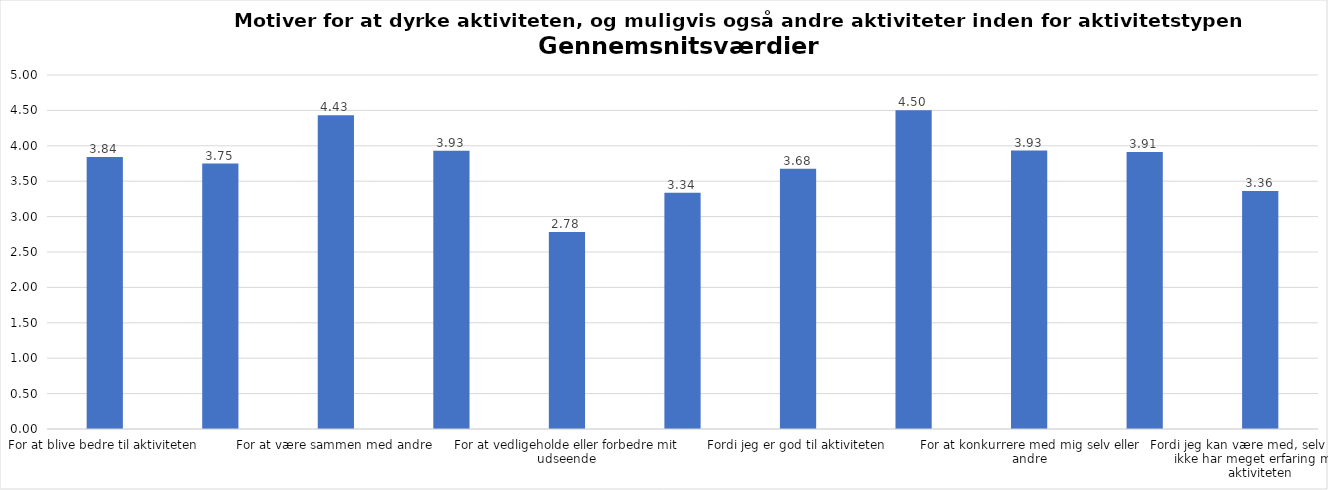
| Category | Gennemsnit |
|---|---|
| For at blive bedre til aktiviteten | 3.841 |
| For at vedligeholde eller forbedre min sundhed (fx helbred, fysisk form) | 3.749 |
| For at være sammen med andre | 4.43 |
| For at gøre noget godt for mig selv | 3.929 |
| For at vedligeholde eller forbedre mit udseende | 2.781 |
| Fordi andre i min omgangskreds opmuntrer mig til det | 3.336 |
| Fordi jeg er god til aktiviteten | 3.676 |
| Fordi jeg godt kan lide aktiviteten | 4.502 |
| For at konkurrere med mig selv eller andre | 3.934 |
| Fordi aktiviteten passer godt ind i min hverdag | 3.912 |
| Fordi jeg kan være med, selv om jeg ikke har meget erfaring med aktiviteten | 3.36 |